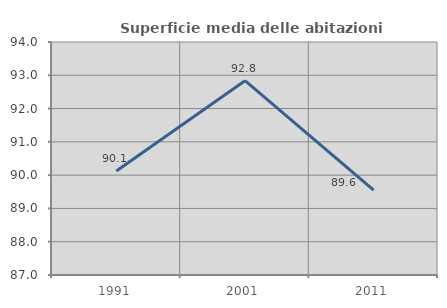
| Category | Superficie media delle abitazioni occupate |
|---|---|
| 1991.0 | 90.126 |
| 2001.0 | 92.838 |
| 2011.0 | 89.55 |